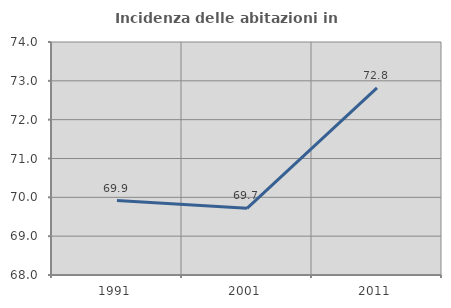
| Category | Incidenza delle abitazioni in proprietà  |
|---|---|
| 1991.0 | 69.917 |
| 2001.0 | 69.717 |
| 2011.0 | 72.821 |